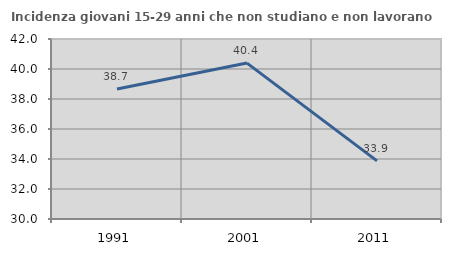
| Category | Incidenza giovani 15-29 anni che non studiano e non lavorano  |
|---|---|
| 1991.0 | 38.672 |
| 2001.0 | 40.394 |
| 2011.0 | 33.875 |